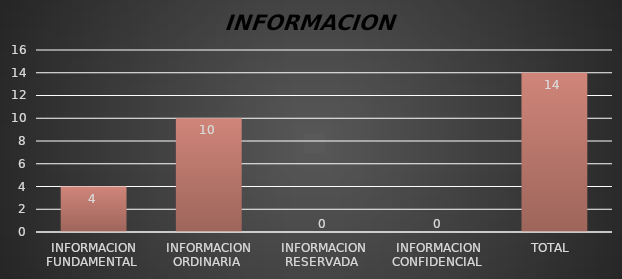
| Category | Series 1 |
|---|---|
| INFORMACION FUNDAMENTAL  | 4 |
| INFORMACION ORDINARIA  | 10 |
| INFORMACION RESERVADA  | 0 |
| INFORMACION CONFIDENCIAL  | 0 |
| TOTAL  | 14 |